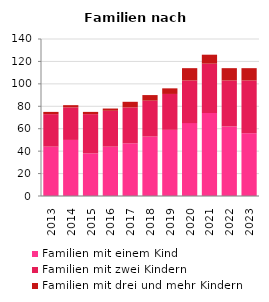
| Category | Familien mit einem Kind | Familien mit zwei Kindern | Familien mit drei und mehr Kindern |
|---|---|---|---|
| 2013.0 | 44 | 29 | 2 |
| 2014.0 | 50 | 29 | 2 |
| 2015.0 | 38 | 35 | 2 |
| 2016.0 | 44 | 32 | 2 |
| 2017.0 | 47 | 32 | 5 |
| 2018.0 | 53 | 32 | 5 |
| 2019.0 | 59 | 32 | 5 |
| 2020.0 | 65 | 38 | 11 |
| 2021.0 | 74 | 44 | 8 |
| 2022.0 | 62 | 41 | 11 |
| 2023.0 | 56 | 47 | 11 |